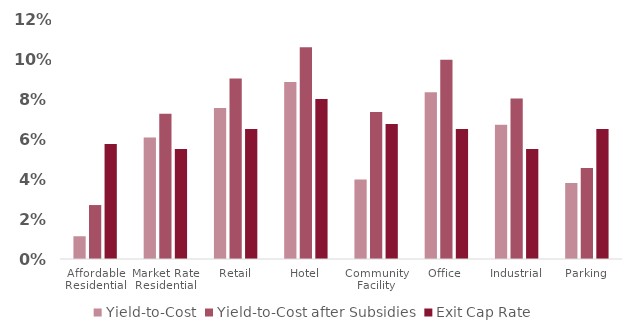
| Category | Yield-to-Cost | Yield-to-Cost after Subsidies | Exit Cap Rate |
|---|---|---|---|
| Affordable Residential | 0.011 | 0.027 | 0.058 |
| Market Rate Residential | 0.061 | 0.073 | 0.055 |
| Retail | 0.076 | 0.09 | 0.065 |
| Hotel | 0.089 | 0.106 | 0.08 |
| Community Facility | 0.04 | 0.073 | 0.068 |
| Office | 0.083 | 0.1 | 0.065 |
| Industrial | 0.067 | 0.08 | 0.055 |
| Parking | 0.038 | 0.045 | 0.065 |